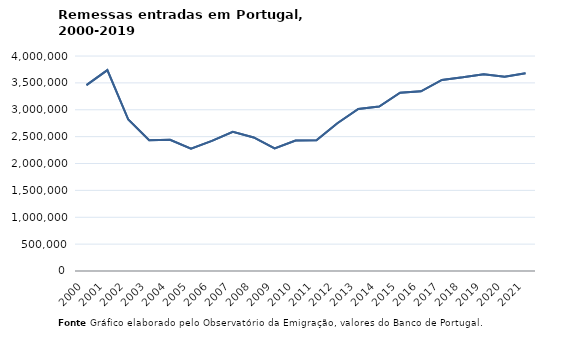
| Category | Entradas |
|---|---|
| 2000.0 | 3458120 |
| 2001.0 | 3736820 |
| 2002.0 | 2817880 |
| 2003.0 | 2433780 |
| 2004.0 | 2442160 |
| 2005.0 | 2277250 |
| 2006.0 | 2420270 |
| 2007.0 | 2588420 |
| 2008.0 | 2484680 |
| 2009.0 | 2281870 |
| 2010.0 | 2425900 |
| 2011.0 | 2430490 |
| 2012.0 | 2749460 |
| 2013.0 | 3015780 |
| 2014.0 | 3060710 |
| 2015.0 | 3315620 |
| 2016.0 | 3343200 |
| 2017.0 | 3554750 |
| 2018.0 | 3604010 |
| 2019.0 | 3662130 |
| 2020.0 | 3612860 |
| 2021.0 | 3677760 |